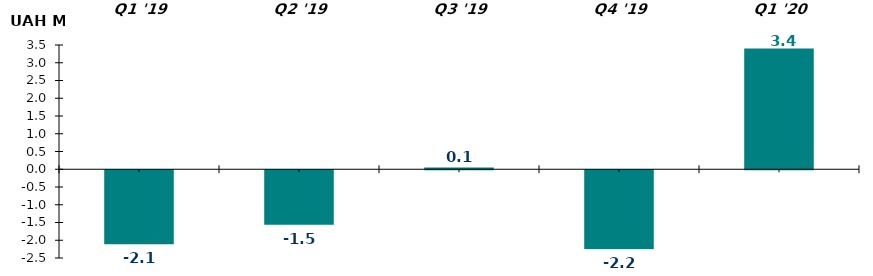
| Category | Net inflow / outflow for the quarter, UAH M |
|---|---|
| Q1 '19 | -2.084 |
| Q2 '19 | -1.537 |
| Q3 '19 | 0.051 |
| Q4 '19 | -2.217 |
| Q1 '20 | 3.4 |